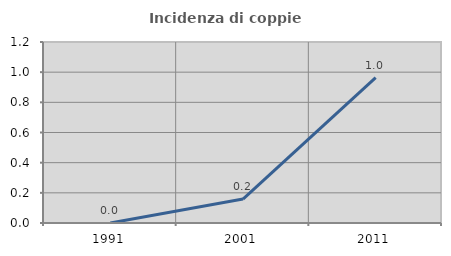
| Category | Incidenza di coppie miste |
|---|---|
| 1991.0 | 0 |
| 2001.0 | 0.159 |
| 2011.0 | 0.963 |